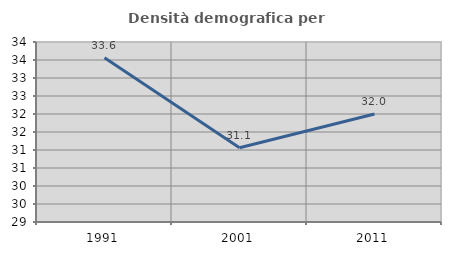
| Category | Densità demografica |
|---|---|
| 1991.0 | 33.563 |
| 2001.0 | 31.062 |
| 2011.0 | 32 |